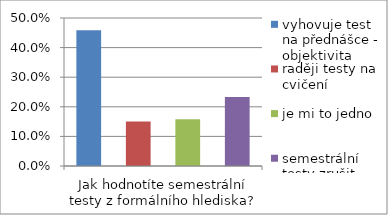
| Category | vyhovuje test na přednášce - objektivita | raději testy na cvičení | je mi to jedno | semestrální testy zrušit |
|---|---|---|---|---|
| Jak hodnotíte semestrální testy z formálního hlediska? | 0.459 | 0.151 | 0.158 | 0.233 |